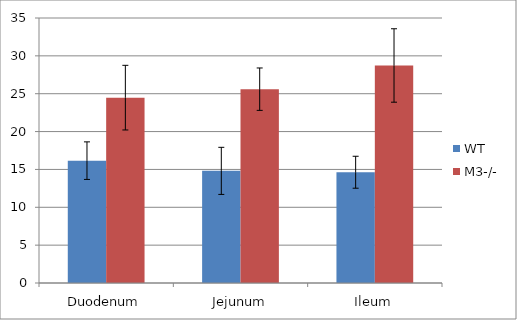
| Category | WT | M3-/- |
|---|---|---|
| Duodenum | 16.16 | 24.48 |
| Jejunum | 14.81 | 25.6 |
| Ileum | 14.63 | 28.73 |